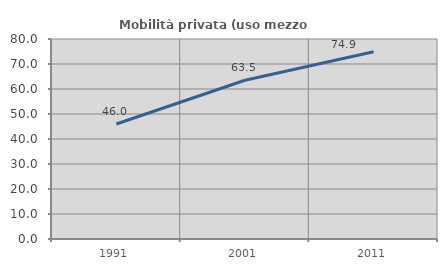
| Category | Mobilità privata (uso mezzo privato) |
|---|---|
| 1991.0 | 45.985 |
| 2001.0 | 63.506 |
| 2011.0 | 74.926 |